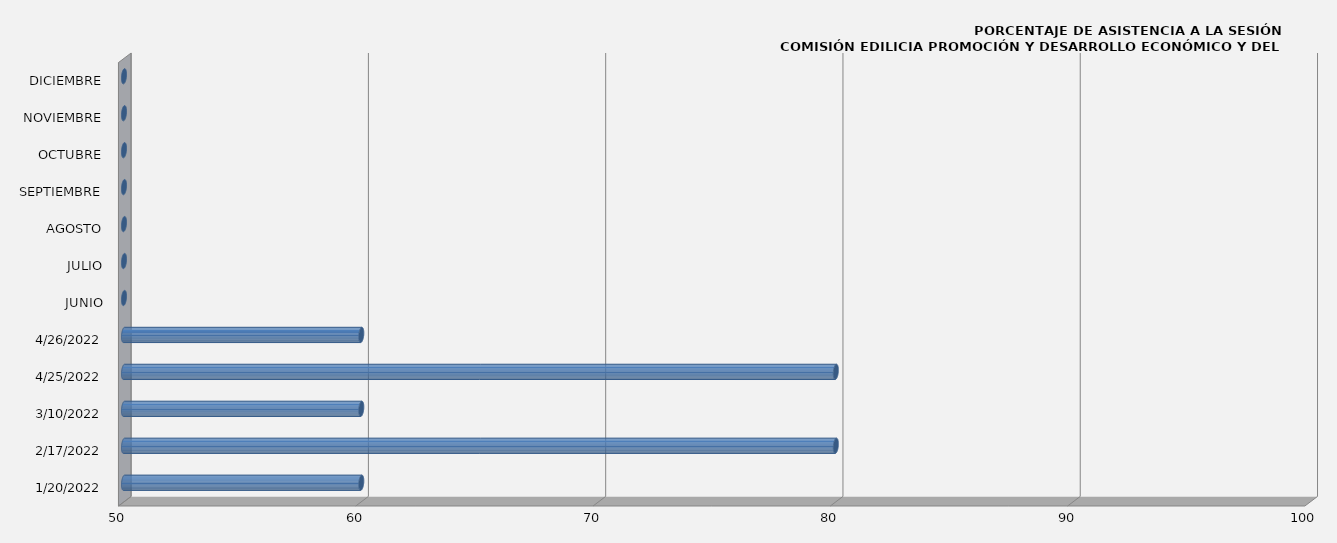
| Category | 20/01/2022 |
|---|---|
| 20/01/2022 | 60 |
| 17/02/2022 | 80 |
| 10/03/2022 | 60 |
| 25/04/2022 | 80 |
| 26/04/2022 | 60 |
| JUNIO | 0 |
| JULIO | 0 |
| AGOSTO | 0 |
| SEPTIEMBRE | 0 |
| OCTUBRE | 0 |
| NOVIEMBRE | 0 |
| DICIEMBRE | 0 |